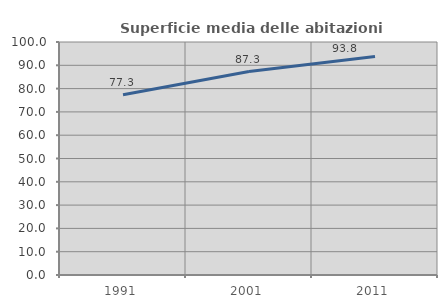
| Category | Superficie media delle abitazioni occupate |
|---|---|
| 1991.0 | 77.327 |
| 2001.0 | 87.313 |
| 2011.0 | 93.793 |